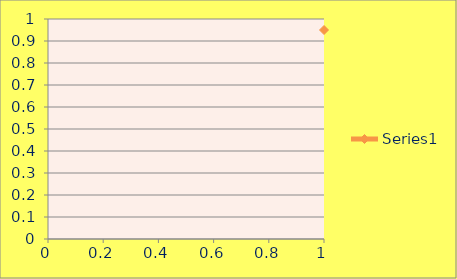
| Category | Series 0 |
|---|---|
| 0 | 0.95 |
| 1 | 0.9 |
| 2 | 0.85 |
| 3 | 0.8 |
| 4 | 0.75 |
| 5 | 0.7 |
| 6 | 0.65 |
| 7 | 0.6 |
| 8 | 0.55 |
| 9 | 0.5 |
| 10 | 0.45 |